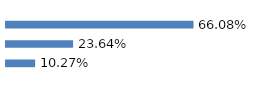
| Category | Series 0 |
|---|---|
| 0 | 0.661 |
| 1 | 0.236 |
| 2 | 0.103 |